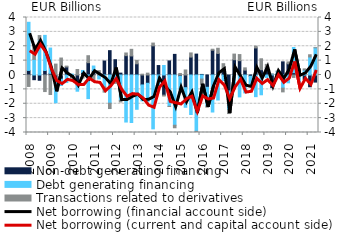
| Category | Non-debt generating financing | Debt generating financing | Transactions related to derivatives |
|---|---|---|---|
| 2008.0 | 0.319 | 3.349 | -0.797 |
| 2008.0 | -0.326 | 1.088 | 0.986 |
| 2008.0 | -0.366 | 2.453 | 0.292 |
| 2008.0 | 0.315 | 2.442 | -1.152 |
| 2009.0 | 0.113 | 1.76 | -1.358 |
| 2009.0 | -0.448 | -1.481 | 0.758 |
| 2009.0 | -0.287 | -0.441 | 1.181 |
| 2009.0 | 0.559 | -0.524 | 0.06 |
| 2010.0 | -0.179 | 0.064 | -0.028 |
| 2010.0 | -0.678 | -0.45 | 0.384 |
| 2010.0 | 0.183 | 0.133 | -0.216 |
| 2010.0 | 0.857 | -1.641 | 0.485 |
| 2011.0 | 0.298 | 0.326 | -0.362 |
| 2011.0 | -0.011 | -0.266 | 0.301 |
| 2011.0 | 0.974 | -0.835 | -0.355 |
| 2011.0 | 1.693 | -1.961 | -0.372 |
| 2012.0 | 1.063 | -0.353 | -0.228 |
| 2012.0 | 0.13 | -1.763 | -0.112 |
| 2012.0 | 1.346 | -3.272 | 0.185 |
| 2012.0 | 1.326 | -3.304 | 0.461 |
| 2013.0 | 0.78 | -2.385 | 0.238 |
| 2013.0 | -0.692 | -1.108 | 0.057 |
| 2013.0 | -0.575 | -1.279 | 0.129 |
| 2013.0 | 2.028 | -3.746 | 0.193 |
| 2014.0 | 0.658 | -0.891 | -0.015 |
| 2014.0 | -1.401 | 0.662 | -0.062 |
| 2014.0 | 0.98 | -2.179 | -0.012 |
| 2014.0 | 1.434 | -3.495 | -0.175 |
| 2015.0 | -0.087 | -0.895 | 0.108 |
| 2015.0 | -0.883 | -1.363 | 0.349 |
| 2015.0 | 1.247 | -2.748 | 0.289 |
| 2015.0 | 1.453 | -3.918 | -0.059 |
| 2016.0 | 0.039 | -0.282 | -0.406 |
| 2016.0 | -0.856 | -1.305 | -0.078 |
| 2016.0 | 1.724 | -2.575 | 0.07 |
| 2016.0 | 1.499 | -1.739 | 0.361 |
| 2017.0 | 0.303 | -0.382 | 0.484 |
| 2017.0 | -1.106 | -1.326 | -0.251 |
| 2017.0 | 1.063 | -0.941 | 0.391 |
| 2017.0 | 0.996 | -1.523 | 0.425 |
| 2018.0 | 0.339 | -1.244 | 0.158 |
| 2018.0 | -0.083 | -0.633 | -0.11 |
| 2018.0 | 1.884 | -1.506 | 0.124 |
| 2018.0 | 0.368 | -1.376 | 0.761 |
| 2019.0 | 0.514 | -0.177 | 0.226 |
| 2019.0 | -0.873 | 0.067 | 0.001 |
| 2019.0 | 0.084 | 0.176 | 0.012 |
| 2019.0 | 0.914 | -0.912 | -0.261 |
| 2020.0 | 0.78 | -0.543 | 0.13 |
| 2020.0 | 0.163 | 1.75 | -0.167 |
| 2020.0 | 0.035 | -0.484 | 0.401 |
| 2020.0 | -0.311 | 0.347 | 0.08 |
| 2021.0 | -0.818 | 1.255 | 0.153 |
| 2021.0 | -0.493 | 1.894 | 0.003 |